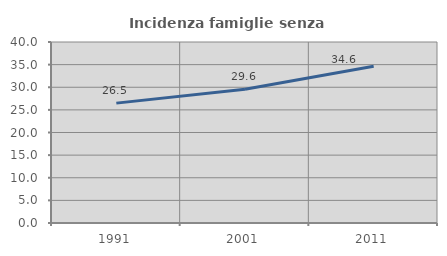
| Category | Incidenza famiglie senza nuclei |
|---|---|
| 1991.0 | 26.49 |
| 2001.0 | 29.56 |
| 2011.0 | 34.648 |